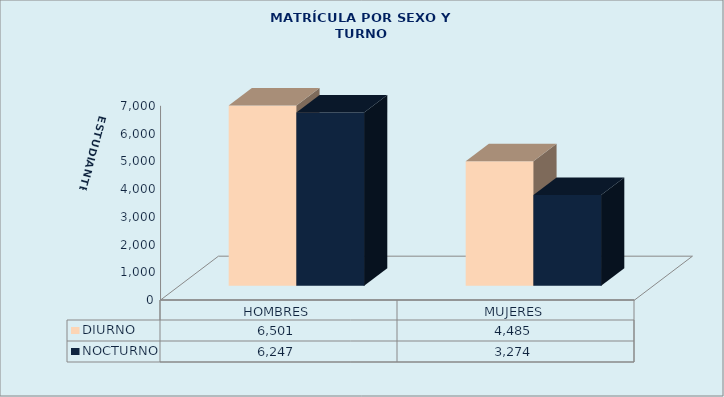
| Category | DIURNO | NOCTURNO |
|---|---|---|
| HOMBRES | 6501 | 6247 |
| MUJERES | 4485 | 3274 |